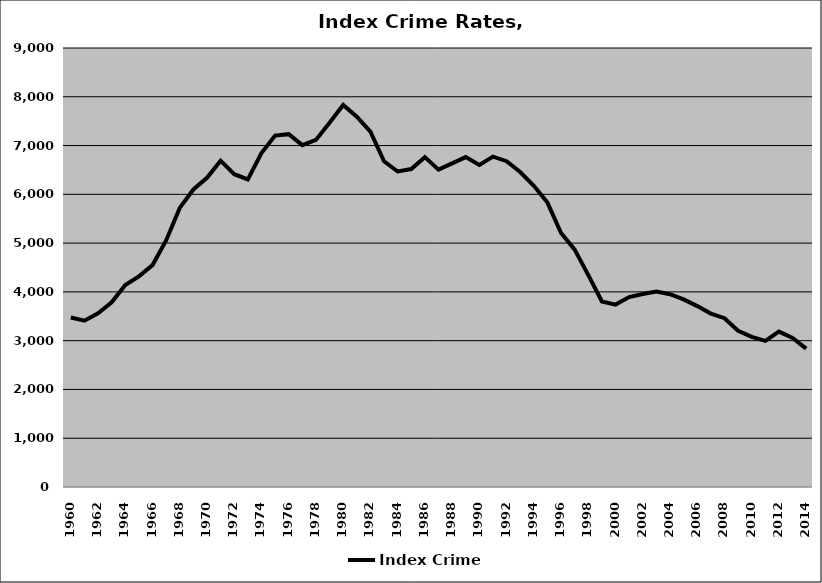
| Category | Index Crime |
|---|---|
| 1960.0 | 3474.339 |
| 1961.0 | 3410.148 |
| 1962.0 | 3560.972 |
| 1963.0 | 3786.97 |
| 1964.0 | 4139.881 |
| 1965.0 | 4319.358 |
| 1966.0 | 4549.434 |
| 1967.0 | 5055.098 |
| 1968.0 | 5721.118 |
| 1969.0 | 6099.681 |
| 1970.0 | 6339.124 |
| 1971.0 | 6690.11 |
| 1972.0 | 6413.108 |
| 1973.0 | 6304.898 |
| 1974.0 | 6846.836 |
| 1975.0 | 7204.593 |
| 1976.0 | 7234.001 |
| 1977.0 | 7008.682 |
| 1978.0 | 7116.188 |
| 1979.0 | 7468.752 |
| 1980.0 | 7833.073 |
| 1981.0 | 7590.492 |
| 1982.0 | 7285.455 |
| 1983.0 | 6677.437 |
| 1984.0 | 6468.348 |
| 1985.0 | 6518.009 |
| 1986.0 | 6762.792 |
| 1987.0 | 6506.42 |
| 1988.0 | 6635.515 |
| 1989.0 | 6763.417 |
| 1990.0 | 6603.614 |
| 1991.0 | 6772.591 |
| 1992.0 | 6679.499 |
| 1993.0 | 6456.906 |
| 1994.0 | 6173.832 |
| 1995.0 | 5831.093 |
| 1996.0 | 5207.764 |
| 1997.0 | 4865.343 |
| 1998.0 | 4342.835 |
| 1999.0 | 3804.976 |
| 2000.0 | 3739.747 |
| 2001.0 | 3893.173 |
| 2002.0 | 3956.553 |
| 2003.0 | 4006.002 |
| 2004.0 | 3951.698 |
| 2005.0 | 3846.61 |
| 2006.0 | 3708.436 |
| 2007.0 | 3555.239 |
| 2008.0 | 3460.706 |
| 2009.0 | 3204.312 |
| 2010.0 | 3076.377 |
| 2011.0 | 2995.348 |
| 2012.0 | 3185.297 |
| 2013.0 | 3053.873 |
| 2014.0 | 2837.191 |